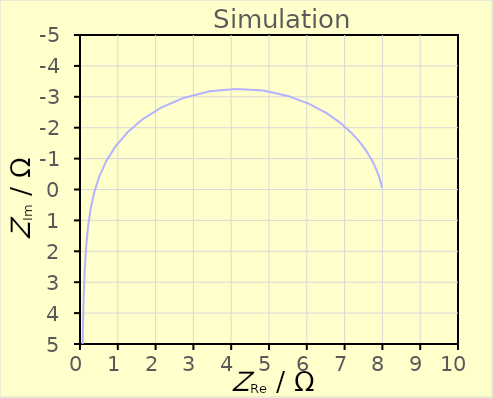
| Category | Calc. |
|---|---|
| 1.19123018546697e-05 | 62831.853 |
| 1.4655528224756e-05 | 49909.115 |
| 1.80305342387156e-05 | 39644.219 |
| 2.21828505176749e-05 | 31490.522 |
| 2.72915452874381e-05 | 25013.811 |
| 3.35769606234239e-05 | 19869.176 |
| 4.13102370859953e-05 | 15782.648 |
| 5.08250421382761e-05 | 12536.603 |
| 6.25320152294966e-05 | 9958.177 |
| 7.69365633112248e-05 | 7910.061 |
| 9.46607907029927e-05 | 6283.185 |
| 0.000116470534110111 | 4990.911 |
| 0.000143308706789058 | 3964.421 |
| 0.000176336447696831 | 3149.051 |
| 0.000216983937995197 | 2501.38 |
| 0.000267013209551248 | 1986.916 |
| 0.00032859585593916 | 1578.263 |
| 0.000404409303153475 | 1253.658 |
| 0.000497756255117532 | 995.815 |
| 0.000612713166824432 | 791.002 |
| 0.000754315210383386 | 628.314 |
| 0.000928787318488502 | 499.085 |
| 0.00114383370180483 | 396.435 |
| 0.00140900200544146 | 314.896 |
| 0.00173614337283248 | 250.127 |
| 0.00213999666747985 | 198.678 |
| 0.00263893475369948 | 157.81 |
| 0.00325592420739021 | 125.346 |
| 0.00401976880023614 | 99.557 |
| 0.00496673404500314 | 79.07 |
| 0.00614268863370118 | 62.794 |
| 0.00760595407598066 | 49.863 |
| 0.00943113407780844 | 39.587 |
| 0.0117143116418656 | 31.421 |
| 0.0145801711906274 | 24.928 |
| 0.0181918492724147 | 19.763 |
| 0.0227646748973009 | 15.653 |
| 0.0285854771637959 | 12.377 |
| 0.0360398784303221 | 9.762 |
| 0.0456510391575071 | 7.669 |
| 0.0581347726419804 | 5.988 |
| 0.0744778935325971 | 4.629 |
| 0.0960491257303287 | 3.521 |
| 0.124754687551475 | 2.606 |
| 0.16325309617626 | 1.838 |
| 0.215243967420609 | 1.179 |
| 0.285839575922881 | 0.597 |
| 0.382007658379894 | 0.067 |
| 0.513025447456461 | -0.43 |
| 0.690788583810096 | -0.91 |
| 0.929658554909022 | -1.379 |
| 1.24532988959789 | -1.836 |
| 1.65208208932298 | -2.27 |
| 2.15806052974047 | -2.658 |
| 2.75929867863598 | -2.971 |
| 3.43498336081529 | -3.178 |
| 4.14765372866848 | -3.256 |
| 4.85046244091756 | -3.201 |
| 5.49913669037289 | -3.029 |
| 6.06260450171265 | -2.773 |
| 6.5273364566441 | -2.468 |
| 6.89508148410618 | -2.148 |
| 7.17720099453889 | -1.838 |
| 7.38901700658543 | -1.552 |
| 7.54590141349664 | -1.298 |
| 7.66126661157795 | -1.078 |
| 7.74591166554205 | -0.89 |
| 7.80811108051624 | -0.732 |
| 7.85401123459815 | -0.601 |
| 7.8880918986048 | -0.492 |
| 7.91358332951172 | -0.402 |
| 7.93280350240117 | -0.328 |
| 7.94741479450422 | -0.268 |
| 7.95861252090249 | -0.218 |
| 7.96726045881179 | -0.178 |
| 7.97398702913697 | -0.145 |
| 7.97925309011003 | -0.118 |
| 7.98339959608082 | -0.096 |
| 7.98668111951664 | -0.078 |
| 7.98928950059573 | -0.063 |
| 7.99137061534111 | -0.052 |